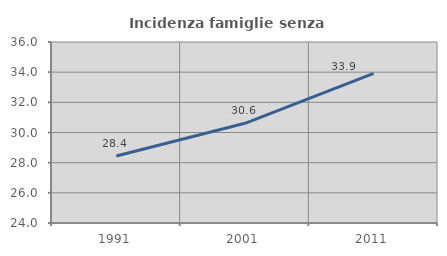
| Category | Incidenza famiglie senza nuclei |
|---|---|
| 1991.0 | 28.44 |
| 2001.0 | 30.609 |
| 2011.0 | 33.914 |